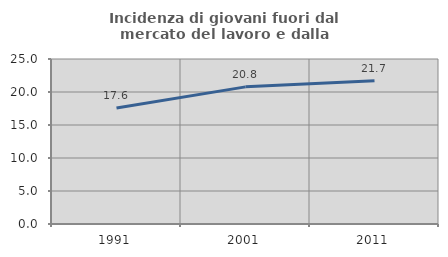
| Category | Incidenza di giovani fuori dal mercato del lavoro e dalla formazione  |
|---|---|
| 1991.0 | 17.565 |
| 2001.0 | 20.779 |
| 2011.0 | 21.723 |